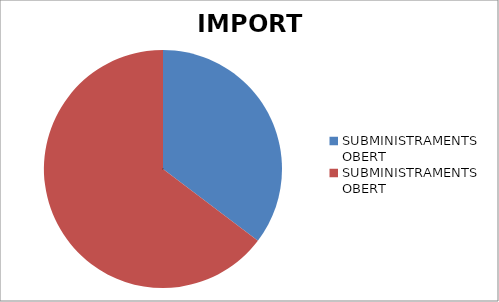
| Category | IMPORT D'ADJUDICACIÓ |
|---|---|
| 0 | 5075000 |
| 1 | 9296723.73 |